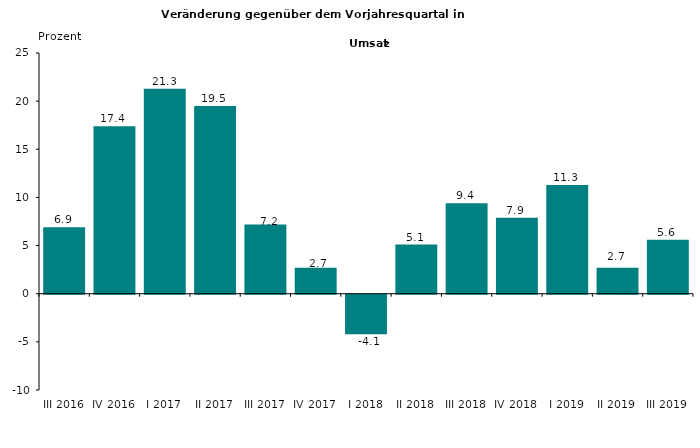
| Category | 6,9 |
|---|---|
| III 2016 | 6.9 |
| IV 2016 | 17.4 |
| I 2017 | 21.3 |
| II 2017 | 19.5 |
| III 2017 | 7.2 |
| IV 2017 | 2.7 |
| I 2018 | -4.1 |
| II 2018 | 5.1 |
| III 2018 | 9.4 |
| IV 2018 | 7.9 |
| I 2019 | 11.3 |
| II 2019 | 2.7 |
| III 2019 | 5.6 |